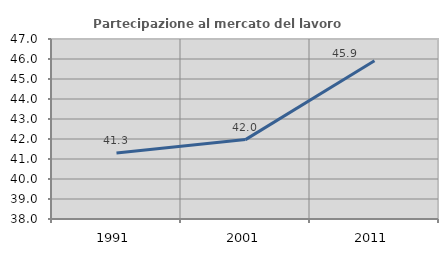
| Category | Partecipazione al mercato del lavoro  femminile |
|---|---|
| 1991.0 | 41.297 |
| 2001.0 | 41.97 |
| 2011.0 | 45.916 |